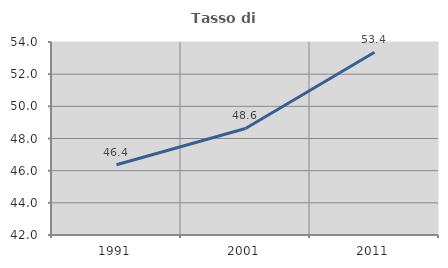
| Category | Tasso di occupazione   |
|---|---|
| 1991.0 | 46.372 |
| 2001.0 | 48.626 |
| 2011.0 | 53.361 |